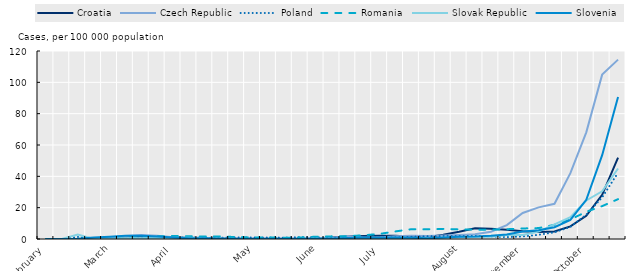
| Category | Croatia | Czech Republic | Poland | Romania | Slovak Republic | Slovenia |
|---|---|---|---|---|---|---|
| February | 0 | 0 | 0 | 0 | 0 | 0 |
|  | 0.018 | 0 | 0 | 0.002 | 0 | 0 |
|  | 0.028 | 0.025 | 1.315 | 0.009 | 2.852 | 0.144 |
|  | 0.077 | 0.176 | 0.024 | 0.06 | 0.079 | 0.927 |
| March | 0.333 | 1.011 | 0.134 | 0.161 | 0.28 | 1.373 |
|  | 1.612 | 1.844 | 0.363 | 0.724 | 0.414 | 1.998 |
|  | 1.728 | 2.563 | 0.75 | 1.391 | 0.406 | 2.073 |
|  | 1.458 | 2.068 | 0.968 | 1.681 | 0.695 | 1.552 |
| April | 1.118 | 1.096 | 0.912 | 1.913 | 0.875 | 0.989 |
|  | 0.683 | 0.971 | 0.945 | 1.729 | 0.815 | 0.474 |
|  | 0.266 | 0.622 | 0.833 | 1.582 | 0.113 | 0.419 |
|  | 0.266 | 0.456 | 0.851 | 1.651 | 0.136 | 0.137 |
|  | 0.214 | 0.441 | 0.997 | 1.196 | 0.066 | 0.076 |
| May | 0.074 | 0.546 | 0.979 | 0.938 | 0.06 | 0.021 |
|  | 0.007 | 0.514 | 0.954 | 0.935 | 0.045 | 0.034 |
|  | 0.007 | 0.447 | 0.852 | 0.825 | 0.016 | 0.076 |
|  | 0.007 | 0.549 | 1.188 | 0.957 | 0.042 | 0.041 |
| June | 0.109 | 0.628 | 1.03 | 1.469 | 0.089 | 0.185 |
|  | 0.908 | 0.848 | 0.782 | 1.69 | 0.176 | 0.309 |
|  | 1.644 | 1.718 | 0.756 | 1.817 | 0.202 | 0.625 |
|  | 1.836 | 0.997 | 0.681 | 2.366 | 0.393 | 0.989 |
| July | 2.12 | 0.912 | 0.824 | 3.253 | 0.249 | 0.844 |
|  | 2.026 | 1.796 | 0.99 | 4.851 | 0.401 | 0.934 |
|  | 1.482 | 2.003 | 1.373 | 6.249 | 0.456 | 0.776 |
|  | 1.15 | 1.993 | 1.744 | 6.171 | 0.605 | 0.467 |
|  | 2.776 | 2.191 | 1.879 | 6.455 | 0.729 | 0.934 |
| August | 4.682 | 2.492 | 1.867 | 6.114 | 1.111 | 1.407 |
|  | 6.852 | 2.986 | 1.956 | 5.97 | 1.318 | 1.531 |
|  | 6.585 | 4.657 | 1.633 | 5.98 | 1.499 | 1.998 |
|  | 5.884 | 8.868 | 1.214 | 6.24 | 2.495 | 2.815 |
| September | 4.928 | 16.636 | 1.611 | 6.727 | 2.632 | 4.785 |
|  | 4.493 | 20.196 | 2.659 | 6.965 | 4.697 | 5.574 |
|  | 4.784 | 22.446 | 4.28 | 9.064 | 9.354 | 7.524 |
|  | 8.012 | 42.017 | 7.737 | 12.424 | 13.873 | 12.158 |
| October | 14.786 | 68.06 | 15.526 | 17.388 | 24.611 | 25.017 |